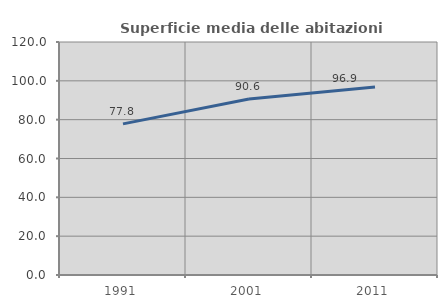
| Category | Superficie media delle abitazioni occupate |
|---|---|
| 1991.0 | 77.847 |
| 2001.0 | 90.624 |
| 2011.0 | 96.877 |